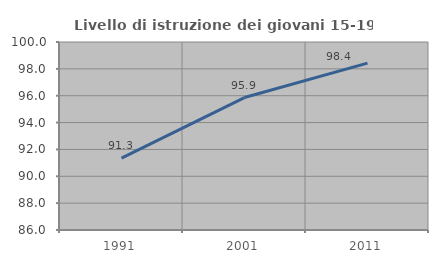
| Category | Livello di istruzione dei giovani 15-19 anni |
|---|---|
| 1991.0 | 91.347 |
| 2001.0 | 95.862 |
| 2011.0 | 98.423 |